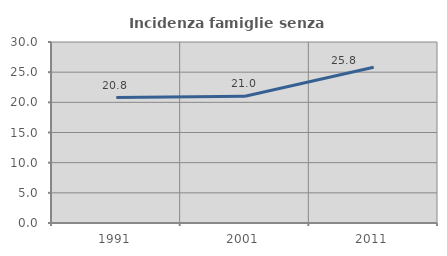
| Category | Incidenza famiglie senza nuclei |
|---|---|
| 1991.0 | 20.79 |
| 2001.0 | 21.006 |
| 2011.0 | 25.806 |